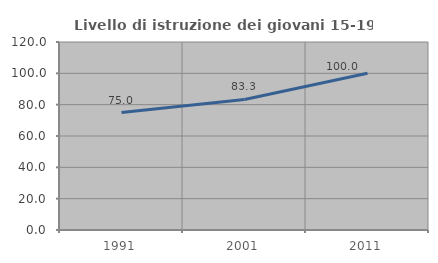
| Category | Livello di istruzione dei giovani 15-19 anni |
|---|---|
| 1991.0 | 75 |
| 2001.0 | 83.333 |
| 2011.0 | 100 |